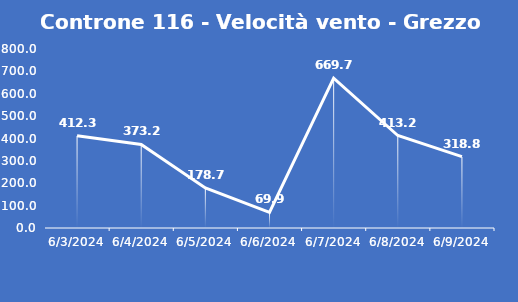
| Category | Controne 116 - Velocità vento - Grezzo (min) |
|---|---|
| 6/3/24 | 412.3 |
| 6/4/24 | 373.2 |
| 6/5/24 | 178.7 |
| 6/6/24 | 69.9 |
| 6/7/24 | 669.7 |
| 6/8/24 | 413.2 |
| 6/9/24 | 318.8 |